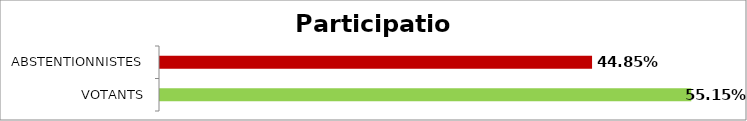
| Category | Participation |
|---|---|
| VOTANTS | 0.551 |
| ABSTENTIONNISTES | 0.449 |